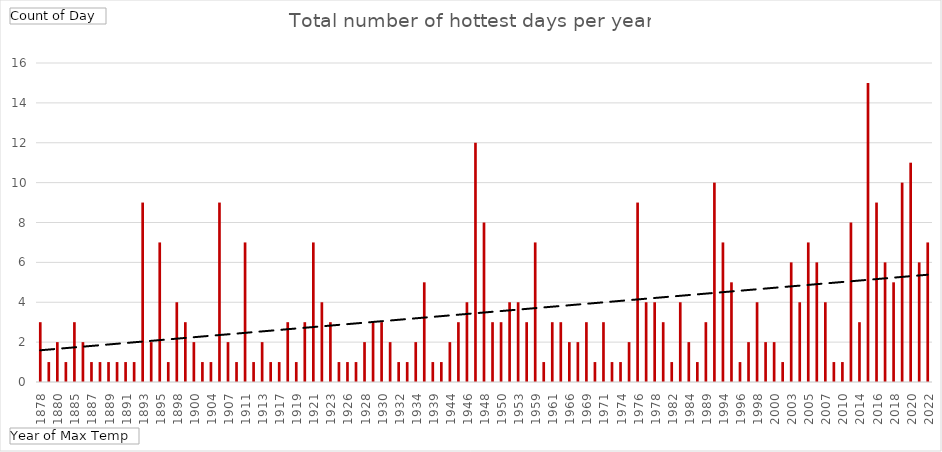
| Category | Total |
|---|---|
| 1878 | 3 |
| 1879 | 1 |
| 1880 | 2 |
| 1881 | 1 |
| 1885 | 3 |
| 1886 | 2 |
| 1887 | 1 |
| 1888 | 1 |
| 1889 | 1 |
| 1890 | 1 |
| 1891 | 1 |
| 1892 | 1 |
| 1893 | 9 |
| 1894 | 2 |
| 1895 | 7 |
| 1897 | 1 |
| 1898 | 4 |
| 1899 | 3 |
| 1900 | 2 |
| 1901 | 1 |
| 1904 | 1 |
| 1906 | 9 |
| 1907 | 2 |
| 1908 | 1 |
| 1911 | 7 |
| 1912 | 1 |
| 1913 | 2 |
| 1916 | 1 |
| 1917 | 1 |
| 1918 | 3 |
| 1919 | 1 |
| 1920 | 3 |
| 1921 | 7 |
| 1922 | 4 |
| 1923 | 3 |
| 1925 | 1 |
| 1926 | 1 |
| 1927 | 1 |
| 1928 | 2 |
| 1929 | 3 |
| 1930 | 3 |
| 1931 | 2 |
| 1932 | 1 |
| 1933 | 1 |
| 1934 | 2 |
| 1938 | 5 |
| 1939 | 1 |
| 1941 | 1 |
| 1944 | 2 |
| 1945 | 3 |
| 1946 | 4 |
| 1947 | 12 |
| 1948 | 8 |
| 1949 | 3 |
| 1950 | 3 |
| 1952 | 4 |
| 1953 | 4 |
| 1957 | 3 |
| 1959 | 7 |
| 1960 | 1 |
| 1961 | 3 |
| 1965 | 3 |
| 1966 | 2 |
| 1968 | 2 |
| 1969 | 3 |
| 1970 | 1 |
| 1971 | 3 |
| 1972 | 1 |
| 1974 | 1 |
| 1975 | 2 |
| 1976 | 9 |
| 1977 | 4 |
| 1978 | 4 |
| 1979 | 3 |
| 1982 | 1 |
| 1983 | 4 |
| 1984 | 2 |
| 1985 | 1 |
| 1989 | 3 |
| 1990 | 10 |
| 1994 | 7 |
| 1995 | 5 |
| 1996 | 1 |
| 1997 | 2 |
| 1998 | 4 |
| 1999 | 2 |
| 2000 | 2 |
| 2002 | 1 |
| 2003 | 6 |
| 2004 | 4 |
| 2005 | 7 |
| 2006 | 6 |
| 2007 | 4 |
| 2008 | 1 |
| 2010 | 1 |
| 2011 | 8 |
| 2014 | 3 |
| 2015 | 15 |
| 2016 | 9 |
| 2017 | 6 |
| 2018 | 5 |
| 2019 | 10 |
| 2020 | 11 |
| 2021 | 6 |
| 2022 | 7 |